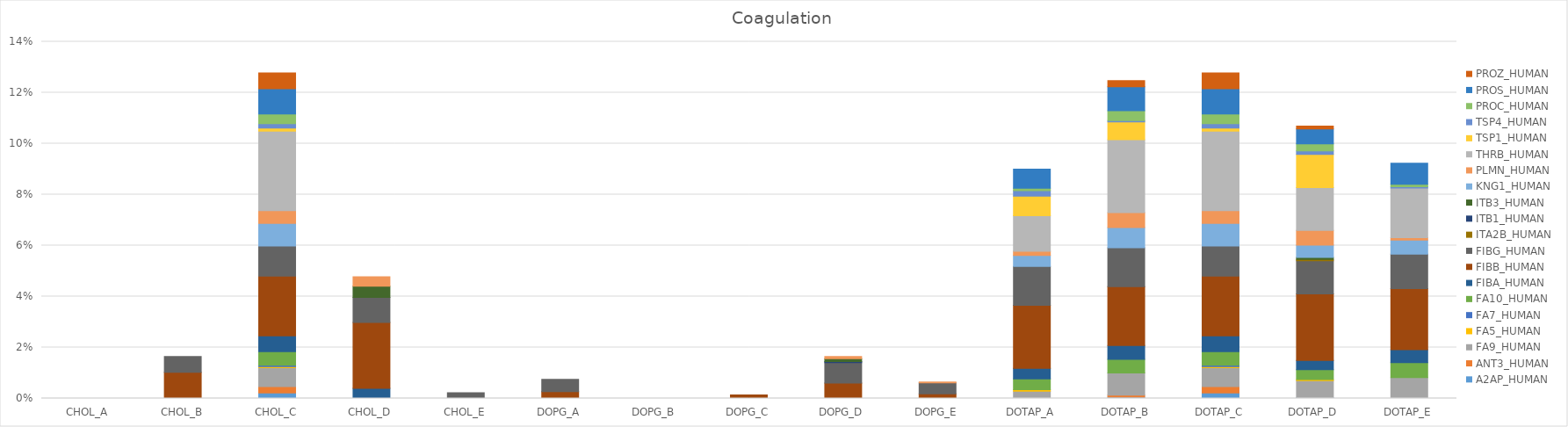
| Category | A2AP_HUMAN | ANT3_HUMAN | FA9_HUMAN | FA5_HUMAN | FA7_HUMAN | FA10_HUMAN | FIBA_HUMAN | FIBB_HUMAN | FIBG_HUMAN | ITA2B_HUMAN | ITB1_HUMAN | ITB3_HUMAN | KNG1_HUMAN | PLMN_HUMAN | THRB_HUMAN | TSP1_HUMAN | TSP4_HUMAN | PROC_HUMAN | PROS_HUMAN | PROZ_HUMAN |
|---|---|---|---|---|---|---|---|---|---|---|---|---|---|---|---|---|---|---|---|---|
| CHOL_A | 0 | 0 | 0 | 0 | 0 | 0 | 0 | 0 | 0 | 0 | 0 | 0 | 0 | 0 | 0 | 0 | 0 | 0 | 0 | 0 |
| CHOL_B | 0 | 0 | 0 | 0 | 0 | 0 | 0 | 0.01 | 0.006 | 0 | 0 | 0 | 0 | 0 | 0 | 0 | 0 | 0 | 0 | 0 |
| CHOL_C | 0.002 | 0.002 | 0.007 | 0 | 0.001 | 0.005 | 0.006 | 0.023 | 0.012 | 0 | 0 | 0 | 0.009 | 0.005 | 0.031 | 0.001 | 0.002 | 0.004 | 0.01 | 0.006 |
| CHOL_D | 0 | 0 | 0 | 0 | 0 | 0 | 0.004 | 0.026 | 0.01 | 0 | 0 | 0.004 | 0 | 0.004 | 0 | 0 | 0 | 0 | 0 | 0 |
| CHOL_E | 0 | 0 | 0 | 0 | 0 | 0 | 0 | 0 | 0.002 | 0 | 0 | 0 | 0 | 0 | 0 | 0 | 0 | 0 | 0 | 0 |
| DOPG_A | 0 | 0 | 0 | 0 | 0 | 0 | 0 | 0.003 | 0.005 | 0 | 0 | 0 | 0 | 0 | 0 | 0 | 0 | 0 | 0 | 0 |
| DOPG_B | 0 | 0 | 0 | 0 | 0 | 0 | 0 | 0 | 0 | 0 | 0 | 0 | 0 | 0 | 0 | 0 | 0 | 0 | 0 | 0 |
| DOPG_C | 0 | 0 | 0 | 0 | 0 | 0 | 0 | 0.001 | 0 | 0 | 0 | 0 | 0 | 0 | 0 | 0 | 0 | 0 | 0 | 0 |
| DOPG_D | 0 | 0 | 0 | 0 | 0 | 0 | 0 | 0.006 | 0.008 | 0 | 0 | 0.001 | 0 | 0.001 | 0 | 0 | 0 | 0 | 0 | 0 |
| DOPG_E | 0 | 0 | 0 | 0 | 0 | 0 | 0 | 0.002 | 0.004 | 0 | 0 | 0 | 0 | 0 | 0 | 0 | 0 | 0 | 0 | 0 |
| DOTAP_A | 0 | 0 | 0.003 | 0.001 | 0 | 0.004 | 0.004 | 0.025 | 0.015 | 0 | 0 | 0 | 0.004 | 0.002 | 0.014 | 0.008 | 0.002 | 0.001 | 0.007 | 0 |
| DOTAP_B | 0.001 | 0.001 | 0.009 | 0 | 0 | 0.005 | 0.005 | 0.023 | 0.015 | 0 | 0 | 0 | 0.008 | 0.006 | 0.029 | 0.007 | 0 | 0.004 | 0.009 | 0.002 |
| DOTAP_C | 0.002 | 0.002 | 0.007 | 0 | 0.001 | 0.005 | 0.006 | 0.023 | 0.012 | 0 | 0 | 0 | 0.009 | 0.005 | 0.031 | 0.001 | 0.002 | 0.004 | 0.01 | 0.006 |
| DOTAP_D | 0 | 0 | 0.007 | 0 | 0 | 0.004 | 0.004 | 0.026 | 0.013 | 0 | 0 | 0.001 | 0.005 | 0.006 | 0.017 | 0.013 | 0.001 | 0.003 | 0.006 | 0.001 |
| DOTAP_E | 0 | 0 | 0.008 | 0 | 0 | 0.006 | 0.005 | 0.024 | 0.014 | 0 | 0 | 0 | 0.006 | 0.001 | 0.02 | 0 | 0.001 | 0.001 | 0.008 | 0 |